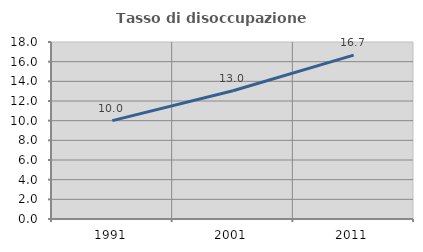
| Category | Tasso di disoccupazione giovanile  |
|---|---|
| 1991.0 | 10 |
| 2001.0 | 13.043 |
| 2011.0 | 16.667 |